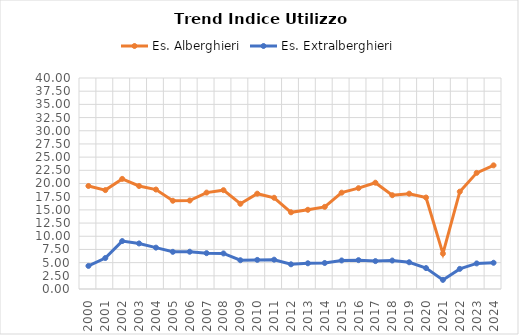
| Category | Es. Alberghieri | Es. Extralberghieri |
|---|---|---|
| 2000.0 | 19.532 | 4.377 |
| 2001.0 | 18.749 | 5.872 |
| 2002.0 | 20.872 | 9.085 |
| 2003.0 | 19.527 | 8.633 |
| 2004.0 | 18.855 | 7.842 |
| 2005.0 | 16.731 | 7.047 |
| 2006.0 | 16.771 | 7.066 |
| 2007.0 | 18.275 | 6.794 |
| 2008.0 | 18.736 | 6.74 |
| 2009.0 | 16.155 | 5.453 |
| 2010.0 | 18.069 | 5.517 |
| 2011.0 | 17.294 | 5.558 |
| 2012.0 | 14.541 | 4.682 |
| 2013.0 | 15.015 | 4.875 |
| 2014.0 | 15.571 | 4.932 |
| 2015.0 | 18.261 | 5.41 |
| 2016.0 | 19.119 | 5.473 |
| 2017.0 | 20.151 | 5.289 |
| 2018.0 | 17.781 | 5.397 |
| 2019.0 | 18.07 | 5.069 |
| 2020.0 | 17.339 | 3.967 |
| 2021.0 | 6.71 | 1.727 |
| 2022.0 | 18.455 | 3.814 |
| 2023.0 | 22.015 | 4.85 |
| 2024.0 | 23.44 | 4.971 |